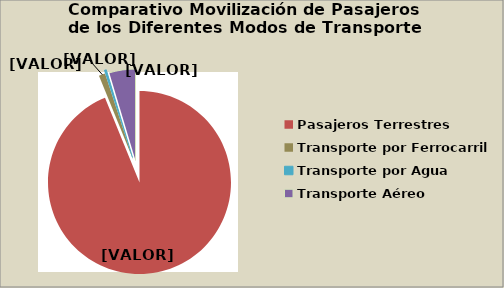
| Category | Series 0 |
|---|---|
| Pasajeros Terrestres | 93.9 |
| Transporte por Ferrocarril | 1.133 |
| Transporte por Agua | 0.402 |
| Transporte Aéreo | 4.626 |